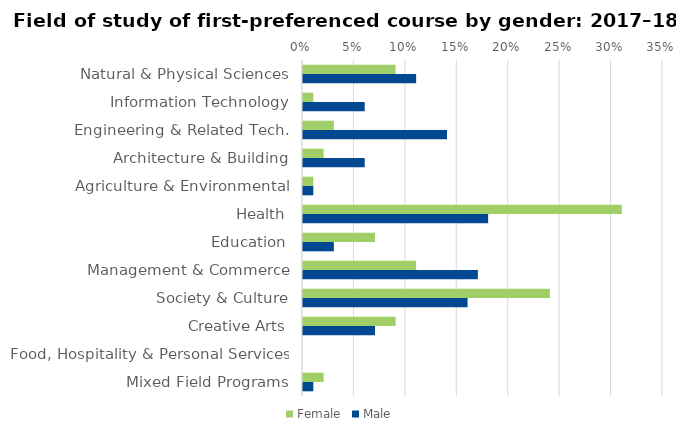
| Category | Female | Male |
|---|---|---|
| Natural & Physical Sciences | 0.09 | 0.11 |
| Information Technology | 0.01 | 0.06 |
| Engineering & Related Tech. | 0.03 | 0.14 |
| Architecture & Building | 0.02 | 0.06 |
| Agriculture & Environmental | 0.01 | 0.01 |
| Health | 0.31 | 0.18 |
| Education | 0.07 | 0.03 |
| Management & Commerce | 0.11 | 0.17 |
| Society & Culture | 0.24 | 0.16 |
| Creative Arts | 0.09 | 0.07 |
| Food, Hospitality & Personal Services | 0 | 0 |
| Mixed Field Programs | 0.02 | 0.01 |